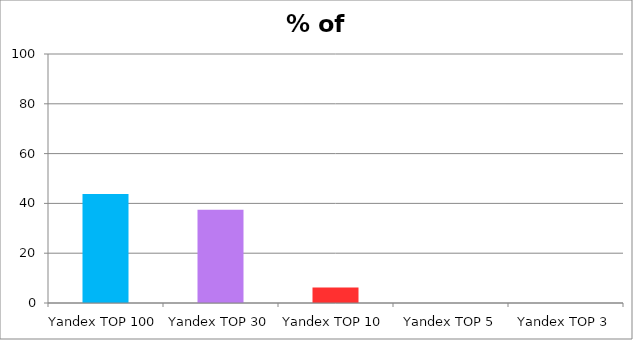
| Category | % of TOP |
|---|---|
| Yandex TOP 100 | 53.91 |
| Yandex TOP 30 | 39.27 |
| Yandex TOP 10 | 24.13 |
| Yandex TOP 5 | 13.35 |
| Yandex TOP 3 | 7.52 |